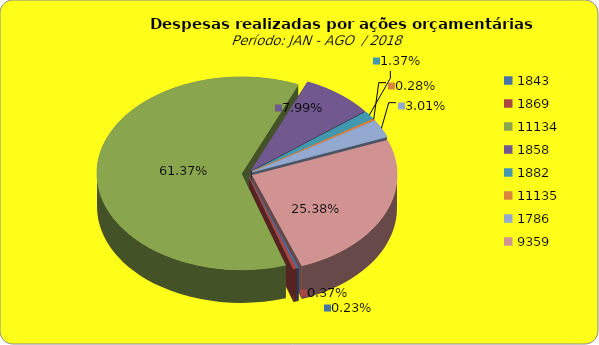
| Category | Series 1 |
|---|---|
| 1843.0 | 413777.12 |
| 1869.0 | 662077.13 |
| 11134.0 | 110351844.52 |
| 1858.0 | 14369373.91 |
| 1882.0 | 2464779.44 |
| 11135.0 | 499896.44 |
| 1786.0 | 5405111.36 |
| 9359.0 | 45641845.01 |